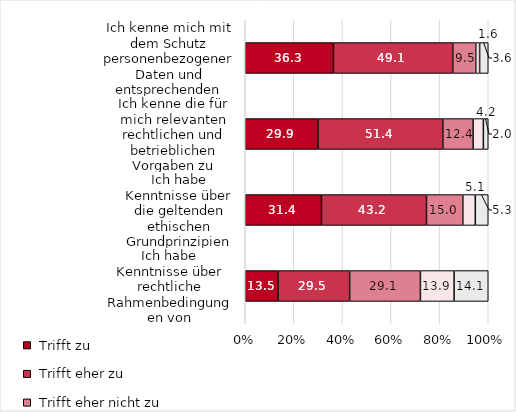
| Category | Series 0 | Series 1 | Series 2 | Series 3 | Series 4 |
|---|---|---|---|---|---|
| Ich kenne mich mit dem Schutz personenbezogener Daten und entsprechenden rechtlichen Rahmenbedingungen aus. | 36.292 | 49.112 | 9.467 | 1.578 | 3.55 |
| Ich kenne die für mich relevanten rechtlichen und betrieblichen Vorgaben zu Informations- und IT-Sicherheit. | 29.92 | 51.406 | 12.45 | 4.217 | 2.008 |
| Ich habe Kenntnisse über die geltenden ethischen Grundprinzipien zur Verwendung von Daten. | 31.352 | 43.238 | 14.959 | 5.123 | 5.328 |
| Ich habe Kenntnisse über rechtliche Rahmenbedingungen von E-Government (z. B. Onlinezugangsgesetz). | 13.454 | 29.518 | 29.116 | 13.855 | 14.056 |